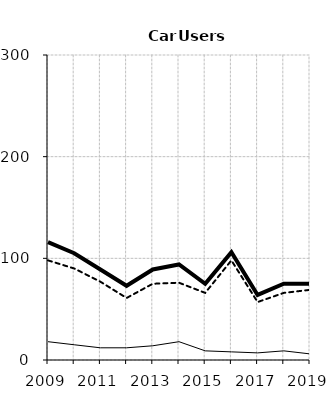
| Category | Built-up | Non built-up | Total |
|---|---|---|---|
| 2009.0 | 18 | 98 | 116 |
| 2010.0 | 15 | 90 | 105 |
| 2011.0 | 12 | 77 | 89 |
| 2012.0 | 12 | 61 | 73 |
| 2013.0 | 14 | 75 | 89 |
| 2014.0 | 18 | 76 | 94 |
| 2015.0 | 9 | 66 | 75 |
| 2016.0 | 8 | 98 | 106 |
| 2017.0 | 7 | 57 | 64 |
| 2018.0 | 9 | 66 | 75 |
| 2019.0 | 6 | 69 | 75 |